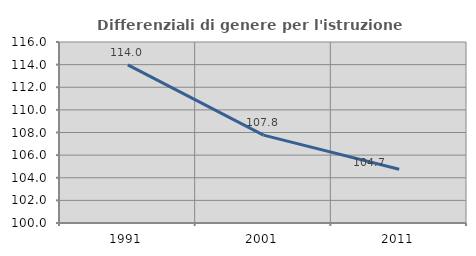
| Category | Differenziali di genere per l'istruzione superiore |
|---|---|
| 1991.0 | 113.972 |
| 2001.0 | 107.767 |
| 2011.0 | 104.747 |